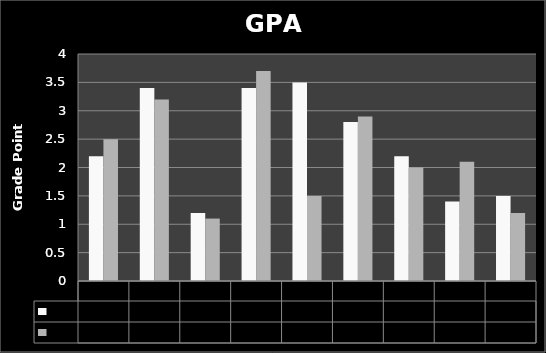
| Category | Pre | Post |
|---|---|---|
| 0 | 2.2 | 2.5 |
| 1 | 3.4 | 3.2 |
| 2 | 1.2 | 1.1 |
| 3 | 3.4 | 3.7 |
| 4 | 3.5 | 1.5 |
| 5 | 2.8 | 2.9 |
| 6 | 2.2 | 2 |
| 7 | 1.4 | 2.1 |
| 8 | 1.5 | 1.2 |